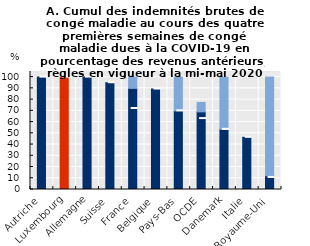
| Category | Versements obligatoires | Versement non obligatoire employeur |
|---|---|---|
| Autriche | 100 | 0 |
| Luxembourg | 100 | 0 |
| Allemagne | 100 | 0 |
| Suisse | 95 | 0 |
| France | 90 | 10 |
| Belgique | 89.41 | 0 |
| Pays-Bas | 70 | 30 |
| OCDE | 69.081 | 8.424 |
| Danemark | 53.531 | 46.469 |
| Italie | 46.429 | 0 |
| Royaume-Uni | 12.215 | 87.785 |